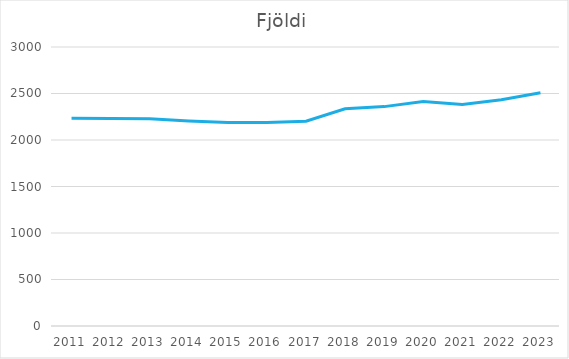
| Category | Fjöldi |
|---|---|
| 2011 | 2234 |
| 2012 | 2232 |
| 2013 | 2228 |
| 2014 | 2205 |
| 2015 | 2189 |
| 2016 | 2189 |
| 2017 | 2202 |
| 2018 | 2336 |
| 2019 | 2359 |
| 2020 | 2414 |
| 2021 | 2383 |
| 2022 | 2433 |
| 2023 | 2508 |